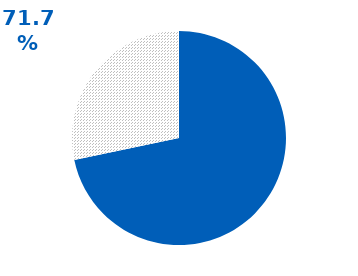
| Category | Series 0 |
|---|---|
| NACE | 0.717 |
| No_NACE | 0.283 |